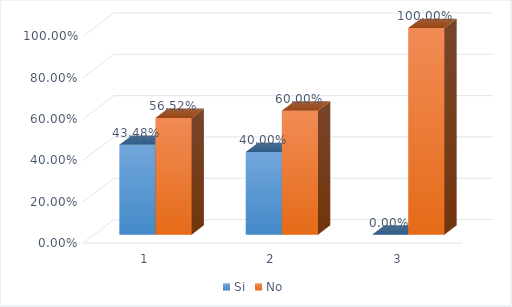
| Category | Si | No |
|---|---|---|
| 0 | 0.435 | 0.565 |
| 1 | 0.4 | 0.6 |
| 2 | 0 | 1 |